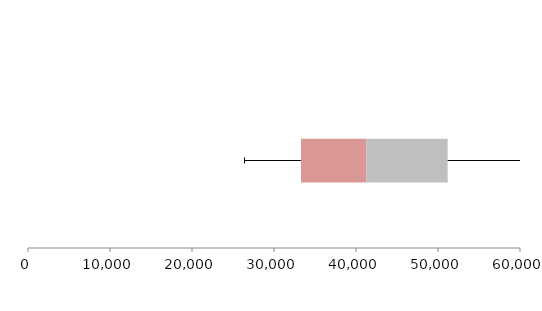
| Category | Series 1 | Series 2 | Series 3 |
|---|---|---|---|
| 0 | 33289.69 | 7979.746 | 9908.099 |